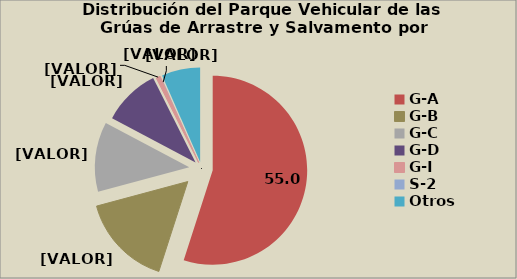
| Category | Series 0 |
|---|---|
| G-A | 55 |
| G-B | 15.856 |
| G-C | 11.949 |
| G-D | 9.848 |
| G-I | 0.714 |
| S-1 | 0.008 |
| S-2 | 0.09 |
| Otros | 6.598 |